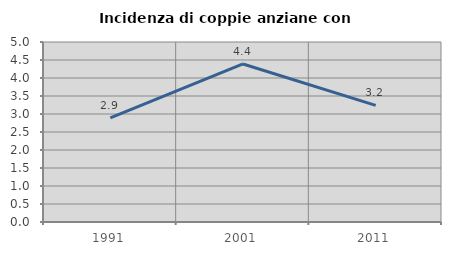
| Category | Incidenza di coppie anziane con figli |
|---|---|
| 1991.0 | 2.892 |
| 2001.0 | 4.39 |
| 2011.0 | 3.24 |